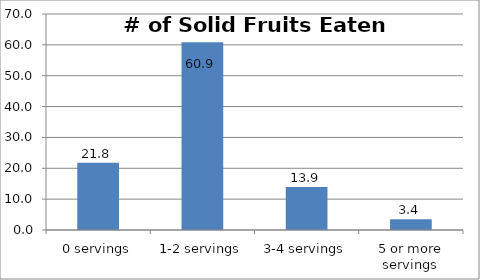
| Category | Series 0 |
|---|---|
| 0 servings | 21.786 |
| 1-2 servings | 60.861 |
| 3-4 servings | 13.906 |
| 5 or more servings | 3.447 |